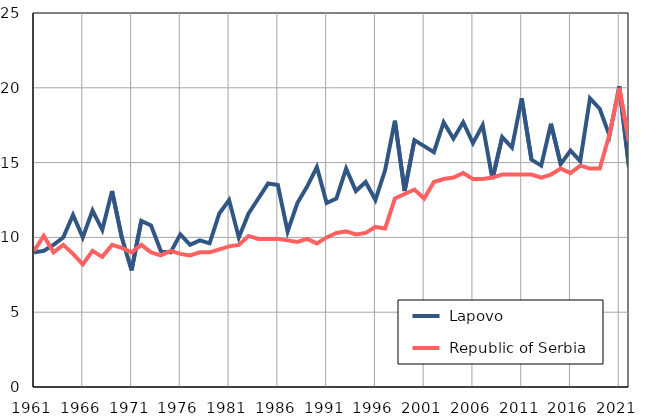
| Category |  Lapovo |  Republic of Serbia |
|---|---|---|
| 1961.0 | 9 | 9.1 |
| 1962.0 | 9.1 | 10.1 |
| 1963.0 | 9.5 | 9 |
| 1964.0 | 10 | 9.5 |
| 1965.0 | 11.5 | 8.9 |
| 1966.0 | 10 | 8.2 |
| 1967.0 | 11.8 | 9.1 |
| 1968.0 | 10.5 | 8.7 |
| 1969.0 | 13.1 | 9.5 |
| 1970.0 | 10 | 9.3 |
| 1971.0 | 7.8 | 9 |
| 1972.0 | 11.1 | 9.5 |
| 1973.0 | 10.8 | 9 |
| 1974.0 | 9.1 | 8.8 |
| 1975.0 | 9 | 9.1 |
| 1976.0 | 10.2 | 8.9 |
| 1977.0 | 9.5 | 8.8 |
| 1978.0 | 9.8 | 9 |
| 1979.0 | 9.6 | 9 |
| 1980.0 | 11.6 | 9.2 |
| 1981.0 | 12.5 | 9.4 |
| 1982.0 | 10 | 9.5 |
| 1983.0 | 11.6 | 10.1 |
| 1984.0 | 12.6 | 9.9 |
| 1985.0 | 13.6 | 9.9 |
| 1986.0 | 13.5 | 9.9 |
| 1987.0 | 10.4 | 9.8 |
| 1988.0 | 12.3 | 9.7 |
| 1989.0 | 13.4 | 9.9 |
| 1990.0 | 14.7 | 9.6 |
| 1991.0 | 12.3 | 10 |
| 1992.0 | 12.6 | 10.3 |
| 1993.0 | 14.6 | 10.4 |
| 1994.0 | 13.1 | 10.2 |
| 1995.0 | 13.7 | 10.3 |
| 1996.0 | 12.5 | 10.7 |
| 1997.0 | 14.5 | 10.6 |
| 1998.0 | 17.8 | 12.6 |
| 1999.0 | 13.1 | 12.9 |
| 2000.0 | 16.5 | 13.2 |
| 2001.0 | 16.1 | 12.6 |
| 2002.0 | 15.7 | 13.7 |
| 2003.0 | 17.7 | 13.9 |
| 2004.0 | 16.6 | 14 |
| 2005.0 | 17.7 | 14.3 |
| 2006.0 | 16.3 | 13.9 |
| 2007.0 | 17.5 | 13.9 |
| 2008.0 | 13.9 | 14 |
| 2009.0 | 16.7 | 14.2 |
| 2010.0 | 16 | 14.2 |
| 2011.0 | 19.3 | 14.2 |
| 2012.0 | 15.2 | 14.2 |
| 2013.0 | 14.8 | 14 |
| 2014.0 | 17.6 | 14.2 |
| 2015.0 | 14.9 | 14.6 |
| 2016.0 | 15.8 | 14.3 |
| 2017.0 | 15.1 | 14.8 |
| 2018.0 | 19.3 | 14.6 |
| 2019.0 | 18.6 | 14.6 |
| 2020.0 | 16.8 | 16.9 |
| 2021.0 | 20.1 | 20 |
| 2022.0 | 14.7 | 16.4 |